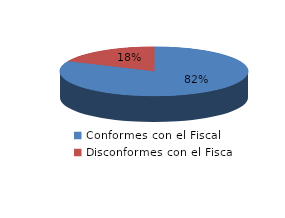
| Category | Series 0 |
|---|---|
| 0 | 9 |
| 1 | 2 |